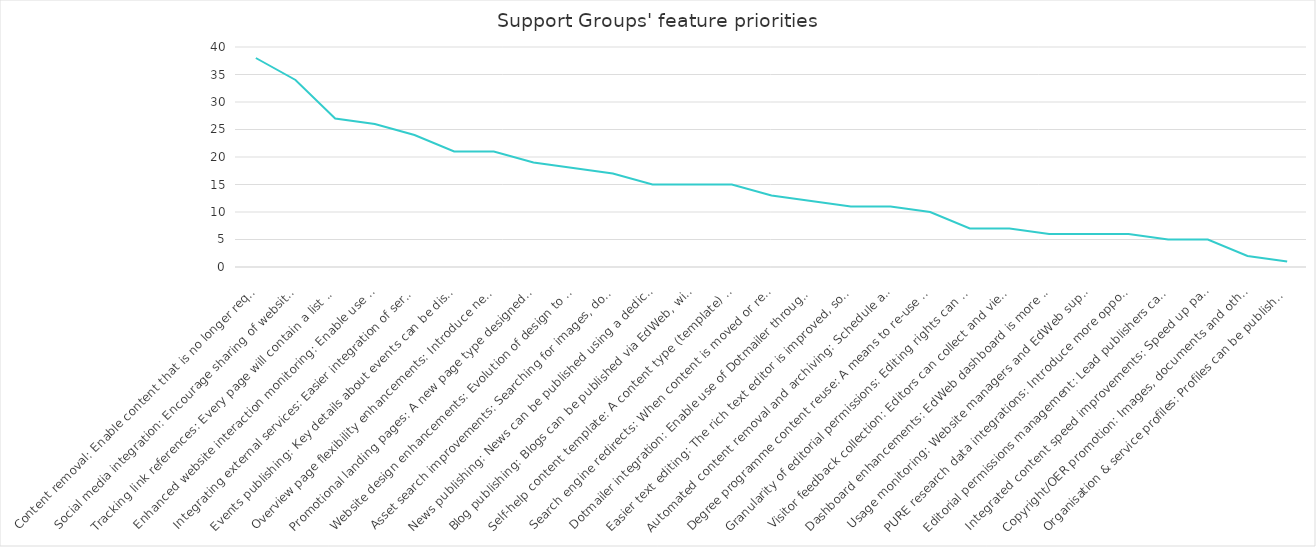
| Category | Series 0 |
|---|---|
| Content removal: Enable content that is no longer required or created in error to be removable, reducing unnecessary clutter in the EdWeb content tree for editors. | 38 |
| Social media integration: Encourage sharing of website content via social media buttons, and features to monitor engagement on popular networks. | 34 |
| Tracking link references: Every page will contain a list of all other EdWeb pages that link to it, so that when it is edited, moved or removed the editor is aware of the impact of their actions on other publishers across the University. | 27 |
| Enhanced website interaction monitoring: Enable use of analytics tools (click heat tracking, A/B testing etc) that provide additional insight into how website visitors are interacting with the website. This informs ongoing content & design improvements. | 26 |
| Integrating external services: Easier integration of services such as Google Maps, You Tube videos, Twitter feeds. Simple URL pasting into EdWeb with no need for interaction with HTML or assets. | 24 |
| Events publishing: Key details about events can be displayed differently in different contexts, such as the automatic creation of an events calendar. | 21 |
| Overview page flexibility enhancements: Introduce new layout options to enable overview pages to dynamically present the content below in a range of ways. | 21 |
| Promotional landing pages: A new page type designed for promotional impact and flexibility, which can be used at any point in a site structure. It will work much like a Generic Content page, but have presentational features similar to a homepage. | 19 |
| Website design enhancements: Evolution of design to improve website visitor experience on small devices, bringing greater focus to content over brand & navigation elements and promoting clearer/easier interactions. | 18 |
| Asset search improvements: Searching for images, documents, videos, content snippets etc is quicker, easier and more efficient. | 17 |
| News publishing: News can be published using a dedicated content type (template); enhancing presentation on different device sizes, allowing more intelligent sharing and promotion in search results. | 15 |
| Blog publishing: Blogs can be published via EdWeb, with sufficient design changes to distinguish from corporate web content, and new navigation and filtering options typically associated with this kind of content (sort by author, by date, by tag etc). | 15 |
| Self-help content template: A content type (template) optimised for presentation of online help and guidance, supporting user self service. | 15 |
| Search engine redirects: When content is moved or removed, enable 301 redirects. This reduces the risk of a website visitor receiving a 'Page not found' error from a search result in the period before the site is re-indexed. | 13 |
| Dotmailer integration: Enable use of Dotmailer through EdWeb as a means to build and manage mailing lists more efficiently. | 12 |
| Easier text editing: The rich text editor is improved, so that it's quicker and easier to make changes to content, to apply stand-out formatting elements and to ensure everything is standards compliant. | 11 |
| Automated content removal and archiving: Schedule archiving and permanent removal of unpublished content after given periods to reduce unnecessary clutter and support compliance with records management legislation. | 11 |
| Degree programme content reuse: A means to re-use and extend golden copy content about degree programmes, that is currently published only via the Degree Finder | 10 |
| Granularity of editorial permissions: Editing rights can be restricted to particular subsections or content types, rather than having access to everything in a particular site. | 7 |
| Visitor feedback collection: Editors can collect and view visitor ratings for page content, to identify strengths and quickly correct any errors. | 7 |
| Dashboard enhancements: EdWeb dashboard is more useful to editors and publishers, speeding up completion of the most common tasks, and can be configured to suit an individual's priorities. | 6 |
| Usage monitoring: Website managers and EdWeb support services have access to data on editorial and publishing activity, which will support better website management, staffing and user support-related decision making. | 6 |
| PURE research data integrations: Introduce more opportunities to present information from the Edinburgh Research Explorer in EdWeb-managed web pages, with no technical knowledge needed. (Currently only publication lists possible). | 6 |
| Editorial permissions management: Lead publishers can assign editorial rights on their website to any trained user, without involving EdWeb support. | 5 |
| Integrated content speed improvements: Speed up page load times for content being delivered from external systems through EdWeb. | 5 |
| Copyright/OER promotion: Images, documents and other assets can be promoted as Open Educational Resources, encouraging reuse of University materials worldwide. | 2 |
| Organisation & service profiles: Profiles can be published using a dedicated content type (template); enhancing presentation on different device sizes, allowing more intelligent sharing and promotion in search results. | 1 |